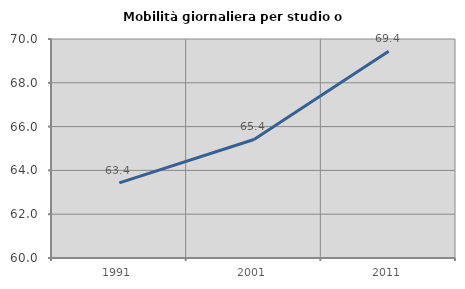
| Category | Mobilità giornaliera per studio o lavoro |
|---|---|
| 1991.0 | 63.431 |
| 2001.0 | 65.413 |
| 2011.0 | 69.437 |